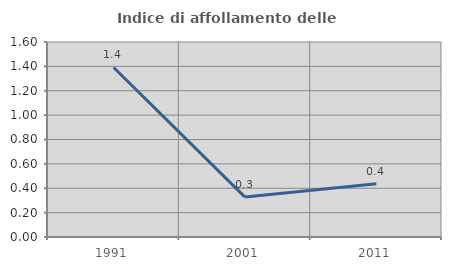
| Category | Indice di affollamento delle abitazioni  |
|---|---|
| 1991.0 | 1.391 |
| 2001.0 | 0.327 |
| 2011.0 | 0.437 |